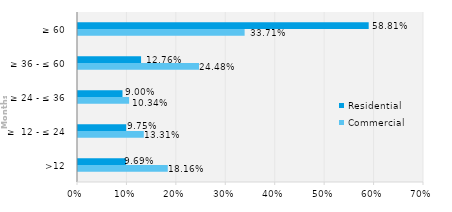
| Category | Commercial | Residential |
|---|---|---|
| >12 | 0.182 | 0.097 |
| ≥  12 - ≤ 24 | 0.133 | 0.098 |
| ≥ 24 - ≤ 36 | 0.103 | 0.09 |
| ≥ 36 - ≤ 60 | 0.245 | 0.128 |
| ≥ 60 | 0.337 | 0.588 |